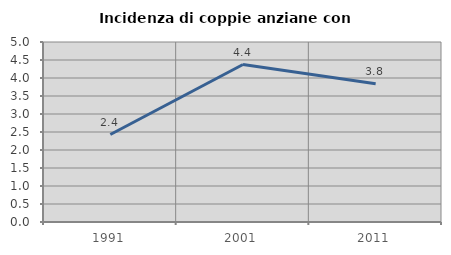
| Category | Incidenza di coppie anziane con figli |
|---|---|
| 1991.0 | 2.43 |
| 2001.0 | 4.374 |
| 2011.0 | 3.843 |